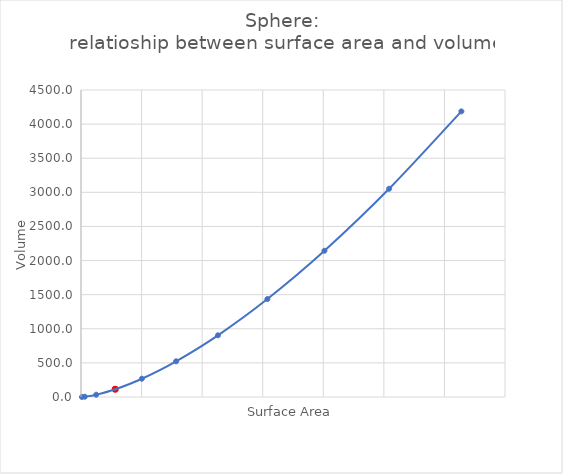
| Category | Series 0 |
|---|---|
| 3.14 | 0.523 |
| 12.56 | 4.187 |
| 50.24 | 33.493 |
| 113.04 | 113.04 |
| 200.96 | 267.947 |
| 314.0 | 523.333 |
| 452.16 | 904.32 |
| 615.44 | 1436.027 |
| 803.84 | 2143.573 |
| 1017.36 | 3052.08 |
| 1256.0 | 4186.667 |